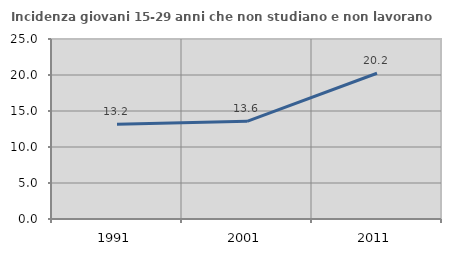
| Category | Incidenza giovani 15-29 anni che non studiano e non lavorano  |
|---|---|
| 1991.0 | 13.152 |
| 2001.0 | 13.571 |
| 2011.0 | 20.243 |